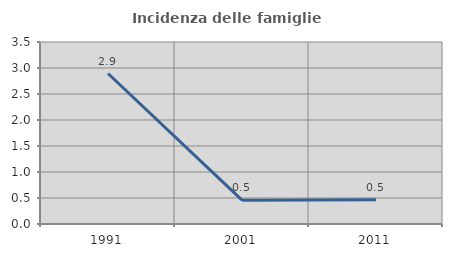
| Category | Incidenza delle famiglie numerose |
|---|---|
| 1991.0 | 2.894 |
| 2001.0 | 0.458 |
| 2011.0 | 0.466 |